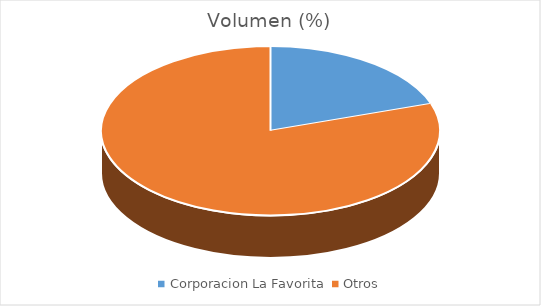
| Category | Volumen |
|---|---|
| Corporacion La Favorita | 75295.35 |
| Otros | 303908.8 |